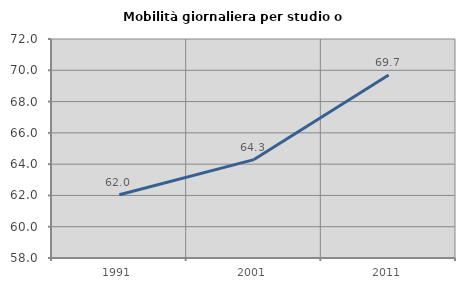
| Category | Mobilità giornaliera per studio o lavoro |
|---|---|
| 1991.0 | 62.045 |
| 2001.0 | 64.291 |
| 2011.0 | 69.7 |